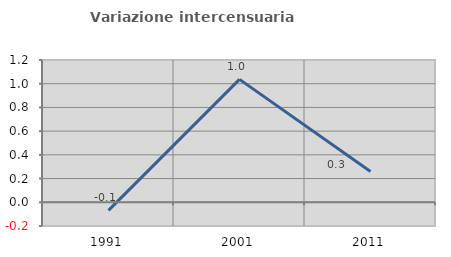
| Category | Variazione intercensuaria annua |
|---|---|
| 1991.0 | -0.068 |
| 2001.0 | 1.037 |
| 2011.0 | 0.26 |